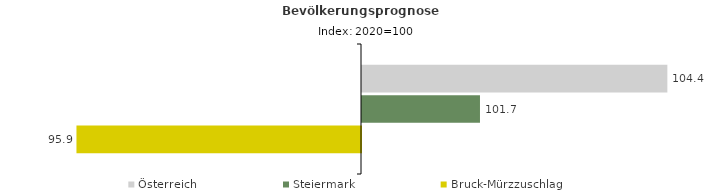
| Category | Österreich | Steiermark | Bruck-Mürzzuschlag |
|---|---|---|---|
| 2020.0 | 104.4 | 101.7 | 95.9 |